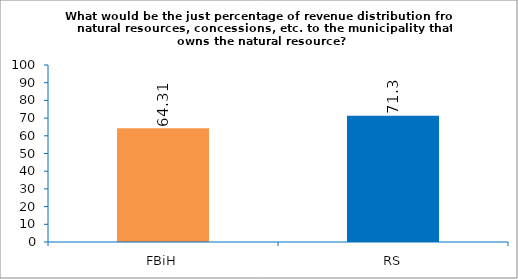
| Category | What would be the just percentage of revenue distribution from natural resources, concessions, etc. to the municipality that owns the natural resource? |
|---|---|
| FBiH | 64.31 |
| RS | 71.3 |